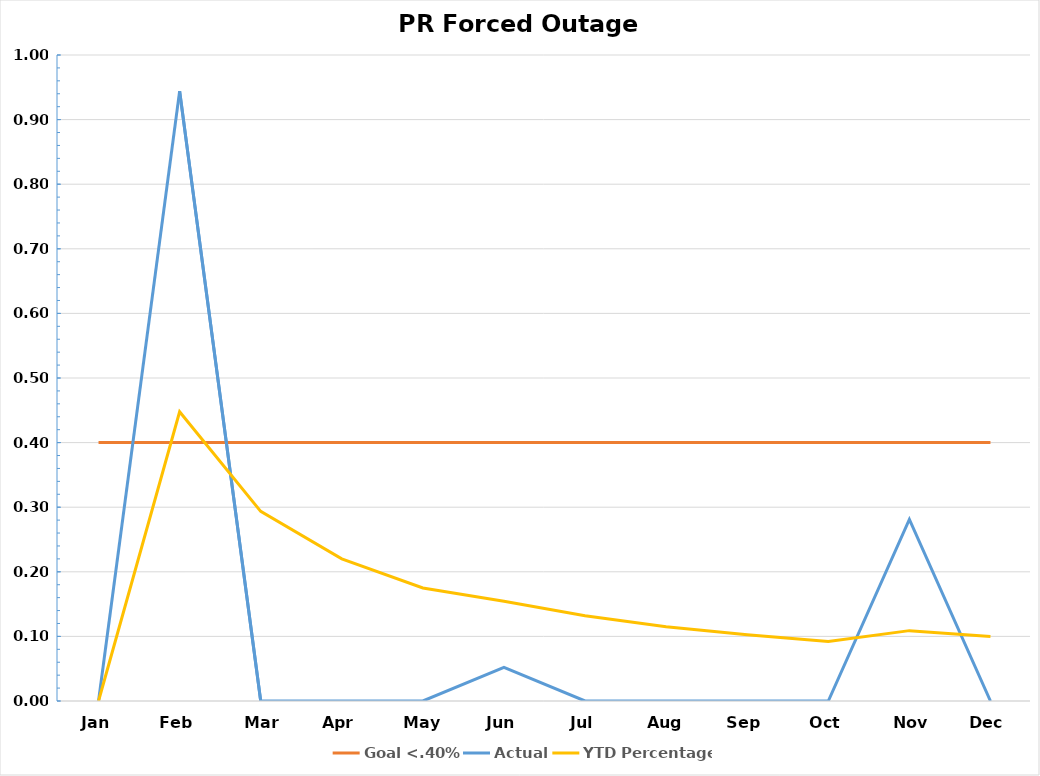
| Category | Goal <.40% | Actual | YTD Percentage |
|---|---|---|---|
| Jan | 0.4 | 0 | 0 |
| Feb | 0.4 | 0.944 | 0.448 |
| Mar | 0.4 | 0 | 0.294 |
| Apr | 0.4 | 0 | 0.22 |
| May | 0.4 | 0 | 0.175 |
| Jun | 0.4 | 0.052 | 0.155 |
| Jul | 0.4 | 0 | 0.132 |
| Aug | 0.4 | 0 | 0.115 |
| Sep | 0.4 | 0 | 0.102 |
| Oct | 0.4 | 0 | 0.092 |
| Nov | 0.4 | 0.281 | 0.109 |
| Dec | 0.4 | 0 | 0.1 |